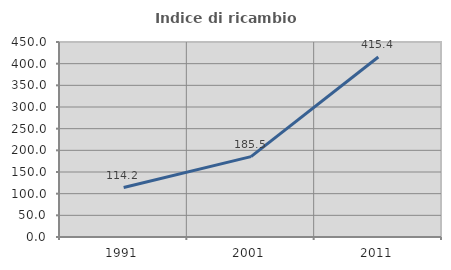
| Category | Indice di ricambio occupazionale  |
|---|---|
| 1991.0 | 114.167 |
| 2001.0 | 185.542 |
| 2011.0 | 415.385 |